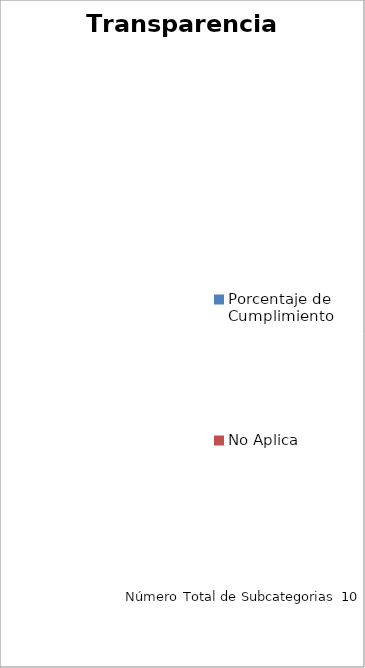
| Category | Transparencia Pasiva |
|---|---|
| Porcentaje de Cumplimiento | 0 |
| No Aplica | 0 |